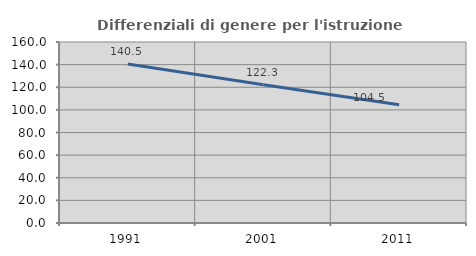
| Category | Differenziali di genere per l'istruzione superiore |
|---|---|
| 1991.0 | 140.541 |
| 2001.0 | 122.27 |
| 2011.0 | 104.515 |